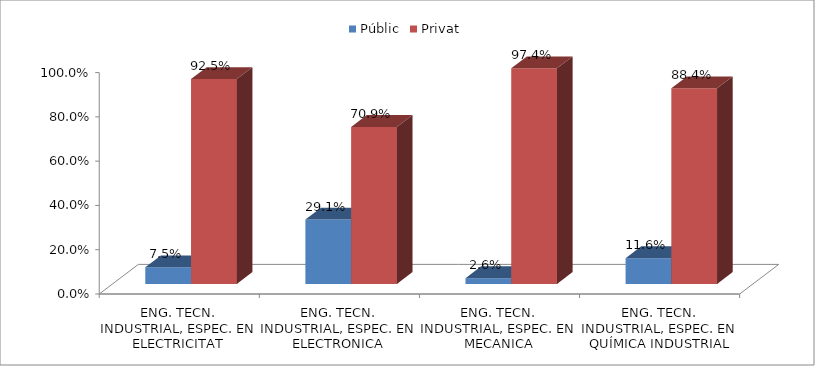
| Category | Públic | Privat |
|---|---|---|
| ENG. TECN. INDUSTRIAL, ESPEC. EN ELECTRICITAT | 0.075 | 0.925 |
| ENG. TECN. INDUSTRIAL, ESPEC. EN ELECTRONICA INDUSTRIAL | 0.291 | 0.709 |
| ENG. TECN. INDUSTRIAL, ESPEC. EN MECANICA | 0.026 | 0.974 |
| ENG. TECN. INDUSTRIAL, ESPEC. EN QUÍMICA INDUSTRIAL | 0.116 | 0.884 |